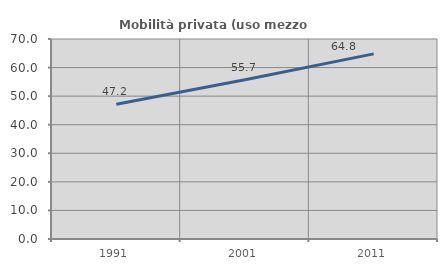
| Category | Mobilità privata (uso mezzo privato) |
|---|---|
| 1991.0 | 47.176 |
| 2001.0 | 55.705 |
| 2011.0 | 64.794 |